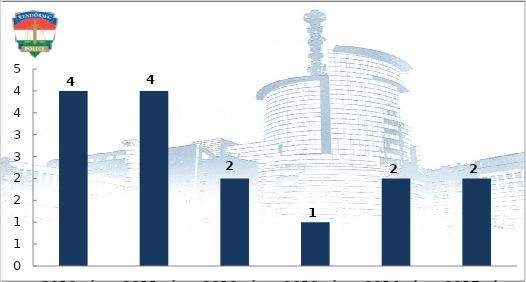
| Category | Meghalt személyek száma (fő) |
|---|---|
| 2010. év | 4 |
| 2011. év | 4 |
| 2012. év | 2 |
| 2013. év | 1 |
| 2014. év | 2 |
| 2015. év | 2 |